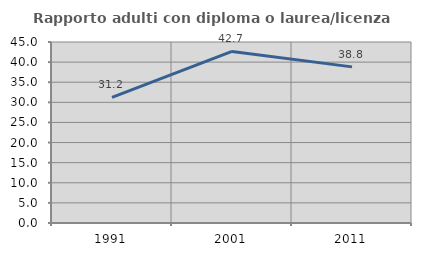
| Category | Rapporto adulti con diploma o laurea/licenza media  |
|---|---|
| 1991.0 | 31.22 |
| 2001.0 | 42.663 |
| 2011.0 | 38.813 |